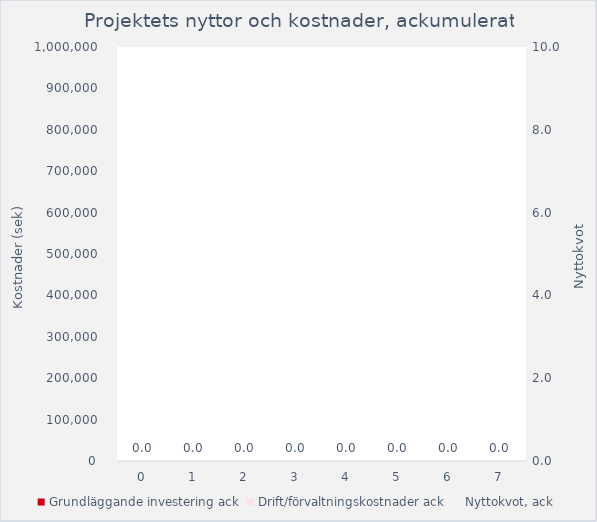
| Category | Grundläggande investering ack | Drift/förvaltningskostnader ack |
|---|---|---|
| 0.0 | 0 | 0 |
| 1.0 | 0 | 0 |
| 2.0 | 0 | 0 |
| 3.0 | 0 | 0 |
| 4.0 | 0 | 0 |
| 5.0 | 0 | 0 |
| 6.0 | 0 | 0 |
| 7.0 | 0 | 0 |